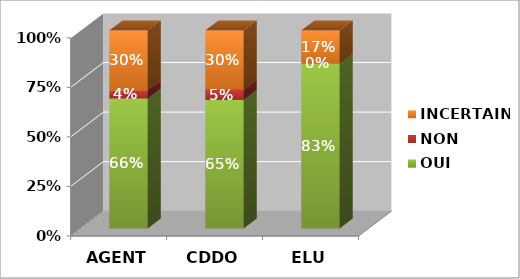
| Category | OUI | NON | INCERTAIN |
|---|---|---|---|
| AGENT | 0.657 | 0.04 | 0.303 |
| CDDO | 0.65 | 0.05 | 0.3 |
| ELU | 0.833 | 0 | 0.167 |